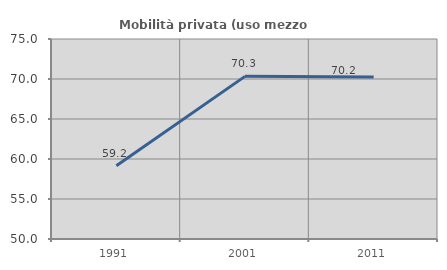
| Category | Mobilità privata (uso mezzo privato) |
|---|---|
| 1991.0 | 59.152 |
| 2001.0 | 70.329 |
| 2011.0 | 70.248 |